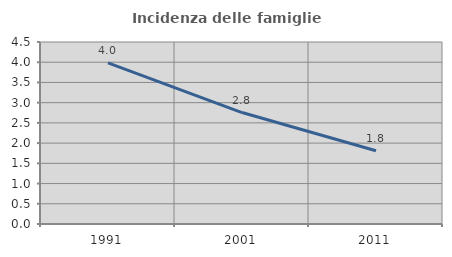
| Category | Incidenza delle famiglie numerose |
|---|---|
| 1991.0 | 3.984 |
| 2001.0 | 2.756 |
| 2011.0 | 1.812 |